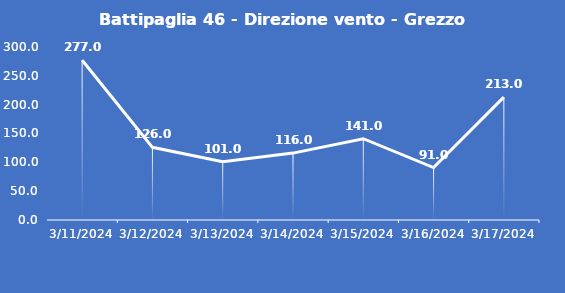
| Category | Battipaglia 46 - Direzione vento - Grezzo (°N) |
|---|---|
| 3/11/24 | 277 |
| 3/12/24 | 126 |
| 3/13/24 | 101 |
| 3/14/24 | 116 |
| 3/15/24 | 141 |
| 3/16/24 | 91 |
| 3/17/24 | 213 |